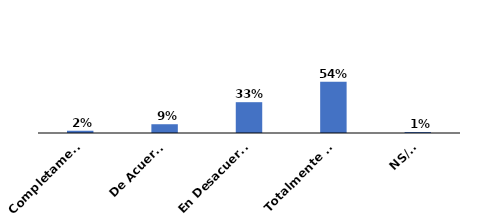
| Category | Series 0 |
|---|---|
| Completamente de acuerdo | 0.024 |
| De Acuerdo | 0.093 |
| En Desacuerdo | 0.328 |
| Totalmente en desacuerdo | 0.544 |
| NS/NR | 0.011 |